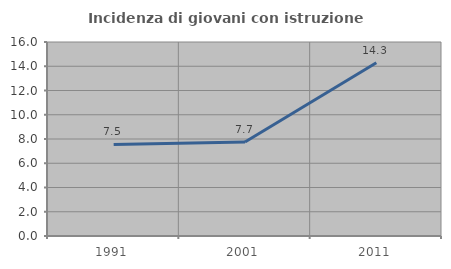
| Category | Incidenza di giovani con istruzione universitaria |
|---|---|
| 1991.0 | 7.547 |
| 2001.0 | 7.746 |
| 2011.0 | 14.286 |